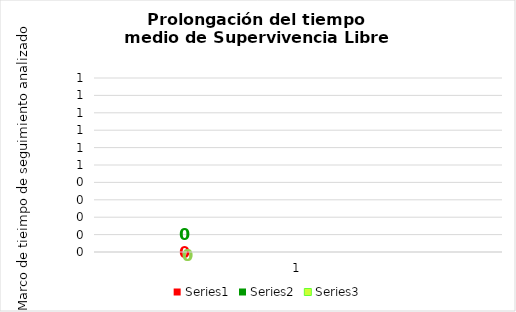
| Category | Series 0 | Series 1 | Series 2 |
|---|---|---|---|
| 0 | 31.306 | 4.939 | 1403.755 |